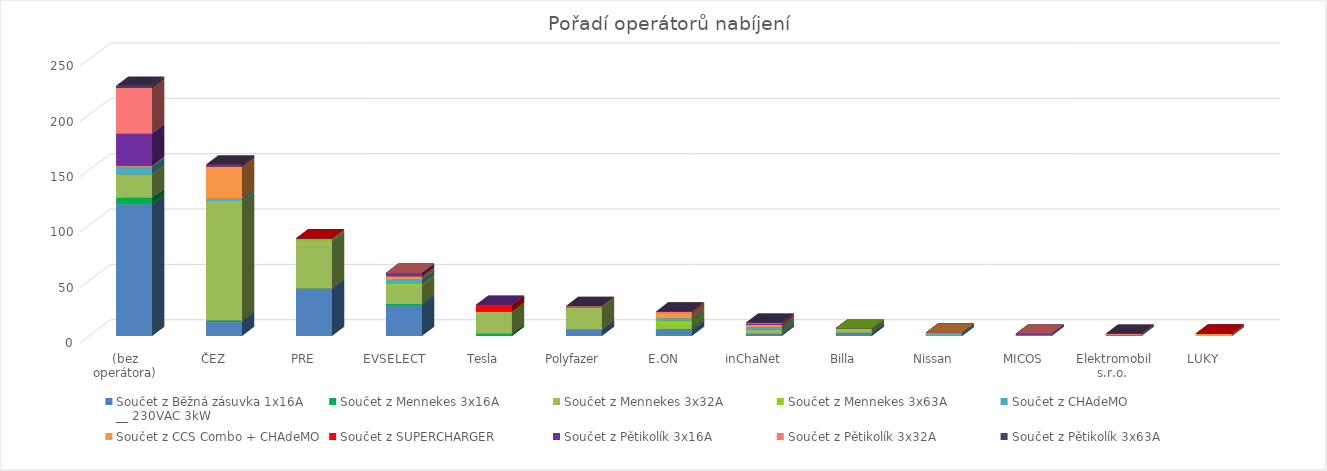
| Category | Součet z Běžná zásuvka 1x16A
__ 230VAC 3kW | Součet z Mennekes 3x16A | Součet z Mennekes 3x32A | Součet z Mennekes 3x63A | Součet z CHAdeMO | Součet z CCS Combo + CHAdeMO | Součet z SUPERCHARGER | Součet z Pětikolík 3x16A | Součet z Pětikolík 3x32A | Součet z Pětikolík 3x63A |
|---|---|---|---|---|---|---|---|---|---|---|
| (bez operátora) | 119 | 6 | 21 | 0 | 7 | 1 | 0 | 29 | 41 | 2 |
| ČEZ | 13 | 1 | 108 | 0 | 2 | 29 | 0 | 1 | 0 | 1 |
| PRE | 43 | 0 | 43 | 1 | 0 | 1 | 0 | 0 | 0 | 0 |
| EVSELECT | 28 | 1 | 16 | 2 | 4 | 3 | 0 | 3 | 0 | 0 |
| Tesla | 0 | 2 | 20 | 0 | 0 | 0 | 6 | 0 | 0 | 0 |
| Polyfazer | 6 | 0 | 20 | 0 | 0 | 0 | 0 | 0 | 1 | 0 |
| E.ON | 5 | 1 | 4 | 4 | 2 | 4 | 0 | 0 | 2 | 0 |
| inChaNet | 2 | 0 | 4 | 0 | 2 | 2 | 0 | 1 | 1 | 0 |
| Billa | 3 | 0 | 4 | 0 | 0 | 0 | 0 | 0 | 0 | 0 |
| Nissan | 0 | 0 | 0 | 0 | 3 | 0 | 0 | 0 | 0 | 0 |
| MICOS | 1 | 0 | 0 | 0 | 0 | 0 | 0 | 1 | 0 | 0 |
| Elektromobil s.r.o.  | 1 | 0 | 0 | 0 | 0 | 0 | 0 | 0 | 1 | 0 |
| LUKY | 0 | 0 | 0 | 0 | 0 | 2 | 0 | 0 | 0 | 0 |